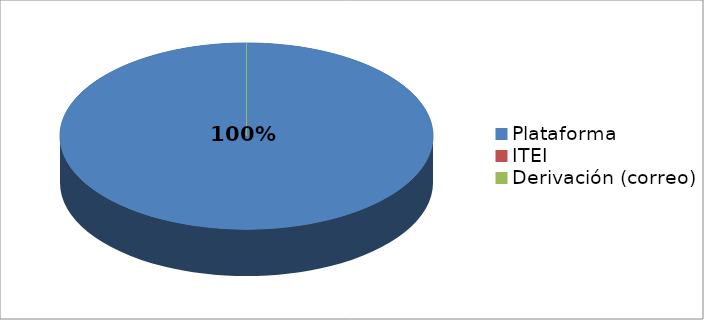
| Category | Series 0 | Series 1 |
|---|---|---|
| Plataforma | 3 | 1 |
| ITEI | 0 | 0 |
| Derivación (correo) | 0 | 0 |